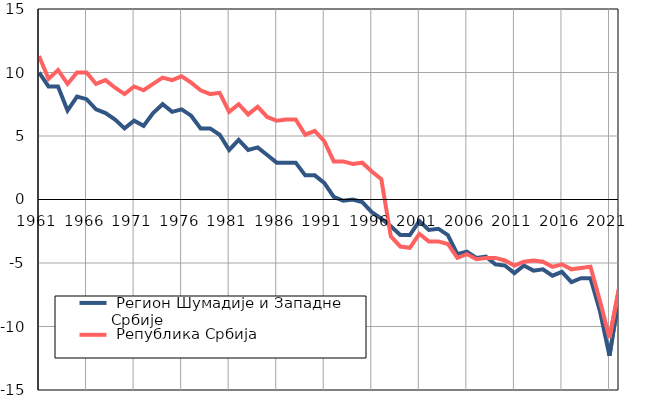
| Category |  Регион Шумадије и Западне Србије |  Република Србија |
|---|---|---|
| 1961.0 | 10 | 11.3 |
| 1962.0 | 8.9 | 9.5 |
| 1963.0 | 8.9 | 10.2 |
| 1964.0 | 7 | 9.1 |
| 1965.0 | 8.1 | 10 |
| 1966.0 | 7.9 | 10 |
| 1967.0 | 7.1 | 9.1 |
| 1968.0 | 6.8 | 9.4 |
| 1969.0 | 6.3 | 8.8 |
| 1970.0 | 5.6 | 8.3 |
| 1971.0 | 6.2 | 8.9 |
| 1972.0 | 5.8 | 8.6 |
| 1973.0 | 6.8 | 9.1 |
| 1974.0 | 7.5 | 9.6 |
| 1975.0 | 6.9 | 9.4 |
| 1976.0 | 7.1 | 9.7 |
| 1977.0 | 6.6 | 9.2 |
| 1978.0 | 5.6 | 8.6 |
| 1979.0 | 5.6 | 8.3 |
| 1980.0 | 5.1 | 8.4 |
| 1981.0 | 3.9 | 6.9 |
| 1982.0 | 4.7 | 7.5 |
| 1983.0 | 3.9 | 6.7 |
| 1984.0 | 4.1 | 7.3 |
| 1985.0 | 3.5 | 6.5 |
| 1986.0 | 2.9 | 6.2 |
| 1987.0 | 2.9 | 6.3 |
| 1988.0 | 2.9 | 6.3 |
| 1989.0 | 1.9 | 5.1 |
| 1990.0 | 1.9 | 5.4 |
| 1991.0 | 1.3 | 4.6 |
| 1992.0 | 0.2 | 3 |
| 1993.0 | -0.1 | 3 |
| 1994.0 | 0 | 2.8 |
| 1995.0 | -0.2 | 2.9 |
| 1996.0 | -1 | 2.2 |
| 1997.0 | -1.5 | 1.6 |
| 1998.0 | -2.1 | -2.9 |
| 1999.0 | -2.8 | -3.7 |
| 2000.0 | -2.8 | -3.8 |
| 2001.0 | -1.7 | -2.7 |
| 2002.0 | -2.4 | -3.3 |
| 2003.0 | -2.3 | -3.3 |
| 2004.0 | -2.8 | -3.5 |
| 2005.0 | -4.3 | -4.6 |
| 2006.0 | -4.1 | -4.3 |
| 2007.0 | -4.6 | -4.7 |
| 2008.0 | -4.5 | -4.6 |
| 2009.0 | -5.1 | -4.6 |
| 2010.0 | -5.2 | -4.8 |
| 2011.0 | -5.8 | -5.2 |
| 2012.0 | -5.2 | -4.9 |
| 2013.0 | -5.6 | -4.8 |
| 2014.0 | -5.5 | -4.9 |
| 2015.0 | -6 | -5.3 |
| 2016.0 | -5.7 | -5.1 |
| 2017.0 | -6.5 | -5.5 |
| 2018.0 | -6.2 | -5.4 |
| 2019.0 | -6.2 | -5.3 |
| 2020.0 | -8.8 | -8 |
| 2021.0 | -12.3 | -10.9 |
| 2022.0 | -7.6 | -7 |